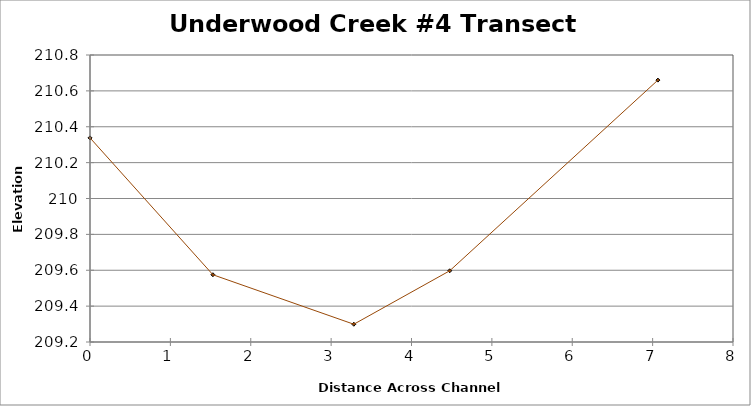
| Category | Series 0 |
|---|---|
| 0.0 | 210.338 |
| 1.5290912331693236 | 209.575 |
| 3.2823883072999753 | 209.299 |
| 4.4754521559168845 | 209.597 |
| 7.0655517123474105 | 210.66 |